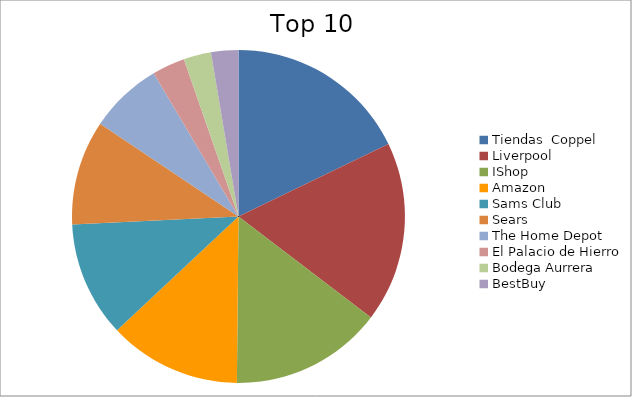
| Category | Series 0 |
|---|---|
| Tiendas  Coppel | 17.84 |
| Liverpool | 17.53 |
| IShop | 14.79 |
| Amazon | 12.86 |
| Sams Club | 11.22 |
| Sears | 10.16 |
| The Home Depot | 7.1 |
| El Palacio de Hierro | 3.19 |
| Bodega Aurrera | 2.67 |
| BestBuy | 2.65 |